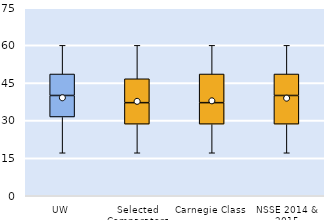
| Category | 25th | 50th | 75th |
|---|---|---|---|
| UW | 31.429 | 8.571 | 8.571 |
| Selected Comparators | 28.571 | 8.571 | 9.524 |
| Carnegie Class | 28.571 | 8.571 | 11.429 |
| NSSE 2014 & 2015 | 28.571 | 11.429 | 8.571 |